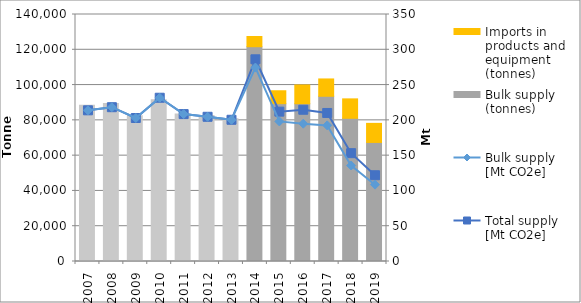
| Category | Bulk supply (tonnes) | Imports in products and equipment (tonnes) |
|---|---|---|
| 2007.0 | 88586.168 | 0 |
| 2008.0 | 89568.834 | 0 |
| 2009.0 | 82680.854 | 0 |
| 2010.0 | 91748.751 | 0 |
| 2011.0 | 83620.143 | 0 |
| 2012.0 | 82714.977 | 0 |
| 2013.0 | 80898.028 | 0 |
| 2014.0 | 121739.316 | 5808.172 |
| 2015.0 | 89474.981 | 7303.606 |
| 2016.0 | 89419.322 | 10630.9 |
| 2017.0 | 93652.645 | 9822.568 |
| 2018.0 | 81176.843 | 11002.4 |
| 2019.0 | 67487.095 | 10805.761 |